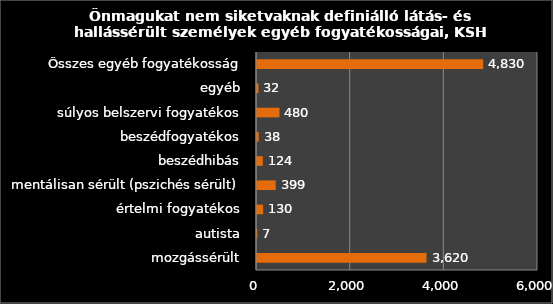
| Category | Series 0 |
|---|---|
| mozgássérült | 3620 |
| autista | 7 |
| értelmi fogyatékos | 130 |
| mentálisan sérült (pszichés sérült) | 399 |
| beszédhibás | 124 |
| beszédfogyatékos | 38 |
| súlyos belszervi fogyatékos | 480 |
| egyéb | 32 |
| Összes egyéb fogyatékosság | 4830 |